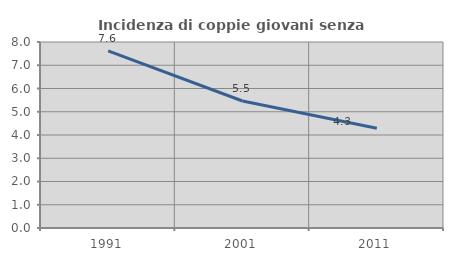
| Category | Incidenza di coppie giovani senza figli |
|---|---|
| 1991.0 | 7.617 |
| 2001.0 | 5.462 |
| 2011.0 | 4.291 |